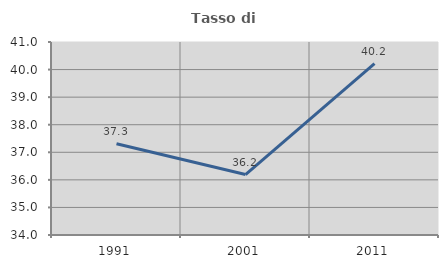
| Category | Tasso di occupazione   |
|---|---|
| 1991.0 | 37.307 |
| 2001.0 | 36.192 |
| 2011.0 | 40.215 |